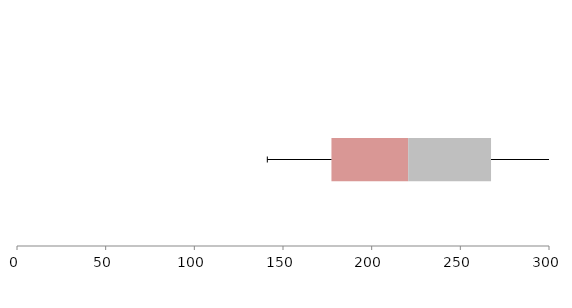
| Category | Series 1 | Series 2 | Series 3 |
|---|---|---|---|
| 0 | 177.325 | 43.266 | 46.719 |